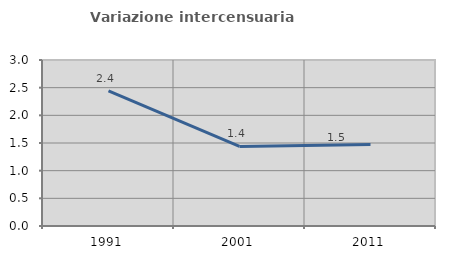
| Category | Variazione intercensuaria annua |
|---|---|
| 1991.0 | 2.441 |
| 2001.0 | 1.439 |
| 2011.0 | 1.474 |